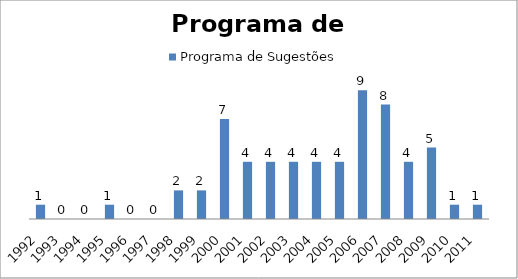
| Category | Programa de Sugestões  |
|---|---|
| 1992.0 | 1 |
| 1993.0 | 0 |
| 1994.0 | 0 |
| 1995.0 | 1 |
| 1996.0 | 0 |
| 1997.0 | 0 |
| 1998.0 | 2 |
| 1999.0 | 2 |
| 2000.0 | 7 |
| 2001.0 | 4 |
| 2002.0 | 4 |
| 2003.0 | 4 |
| 2004.0 | 4 |
| 2005.0 | 4 |
| 2006.0 | 9 |
| 2007.0 | 8 |
| 2008.0 | 4 |
| 2009.0 | 5 |
| 2010.0 | 1 |
| 2011.0 | 1 |